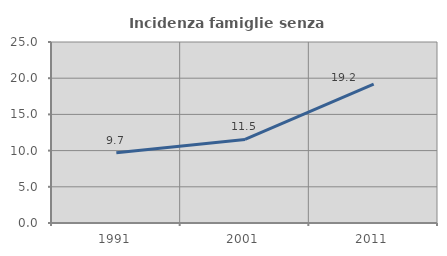
| Category | Incidenza famiglie senza nuclei |
|---|---|
| 1991.0 | 9.712 |
| 2001.0 | 11.543 |
| 2011.0 | 19.171 |